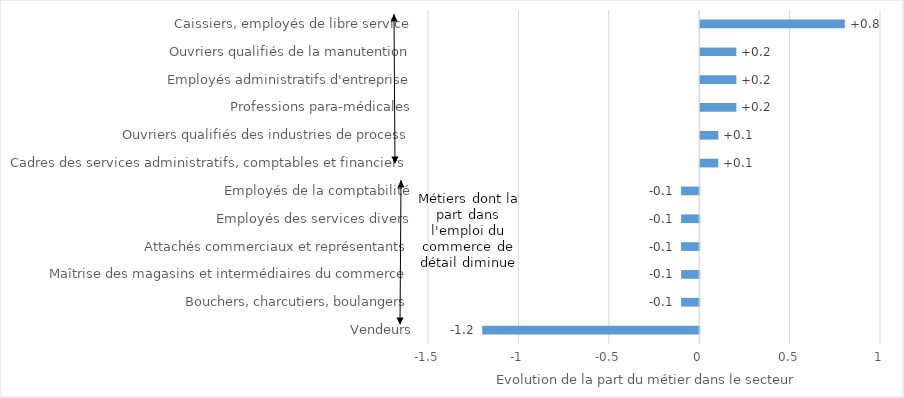
| Category | Evolution 2019 - 2022 (en point de pourcentage) |
|---|---|
| Vendeurs | -1.2 |
| Bouchers, charcutiers, boulangers | -0.1 |
| Maîtrise des magasins et intermédiaires du commerce | -0.1 |
| Attachés commerciaux et représentants | -0.1 |
| Employés des services divers | -0.1 |
| Employés de la comptabilité | -0.1 |
| Cadres des services administratifs, comptables et financiers | 0.1 |
| Ouvriers qualifiés des industries de process | 0.1 |
| Professions para-médicales | 0.2 |
| Employés administratifs d'entreprise | 0.2 |
| Ouvriers qualifiés de la manutention | 0.2 |
| Caissiers, employés de libre service | 0.8 |